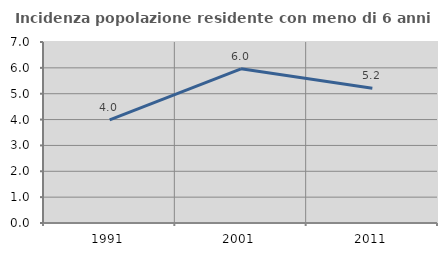
| Category | Incidenza popolazione residente con meno di 6 anni |
|---|---|
| 1991.0 | 3.989 |
| 2001.0 | 5.962 |
| 2011.0 | 5.213 |